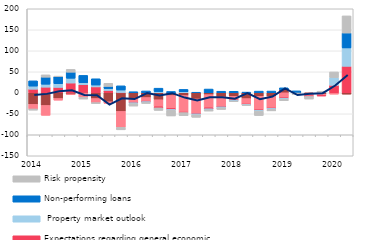
| Category | Costs of funding | Competition from other banks | Expectations regarding general economic situation |  Property market outlook | Non-performing loans  | Risk propensity |
|---|---|---|---|---|---|---|
| 2014.0 | -27.614 | -10.883 | 8.513 | 7.366 | 12.572 | -2.931 |
| nan | -30.154 | -23.565 | 13.381 | 6.958 | 16.79 | 5.591 |
| nan | -13.58 | -4.04 | 12.84 | 8.698 | 16.68 | 1.322 |
| nan | -3.194 | -0.943 | 23.215 | 11.346 | 14.413 | 6.815 |
| 2015.0 | 1.584 | -10.634 | 17.798 | 4.391 | 17.665 | -4.309 |
| nan | -13.709 | -9.748 | 14.011 | 4.433 | 14.906 | -2.291 |
| nan | -21.32 | -4.036 | 5.521 | 4.364 | 5.262 | 7.435 |
| nan | -44.371 | -37.787 | 0.672 | 5.886 | 9.984 | -6.068 |
| 2016.0 | -13.683 | -9.865 | -0.183 | -2.017 | 2.537 | -5.896 |
| nan | -11.339 | -9.602 | -0.197 | -1.974 | 4.34 | -2.332 |
| nan | -16.54 | -16.708 | -2.652 | 2.885 | 8.061 | -6.073 |
| nan | -6.439 | -30.804 | -2.596 | -1.957 | 3.101 | -13.396 |
| 2017.0 | -6.563 | -40.484 | -0.096 | 2.394 | 5.669 | -7.434 |
| nan | -14.708 | -34.121 | -1.211 | -2.234 | 1.309 | -6.144 |
| nan | -4.365 | -31.359 | -2.483 | -2.033 | 8.902 | -3.307 |
| nan | -9.63 | -23.589 | -0.294 | -2.083 | 3.686 | -4.267 |
| 2018.0 | -8.401 | -9.465 | -0.308 | -2.087 | 3.545 | -0.758 |
| nan | -13.817 | -13.719 | -0.384 | -1.143 | 1.627 | -1.188 |
| nan | -8.391 | -32.723 | -0.405 | -2.001 | 3.96 | -10.656 |
| nan | -8.386 | -28.581 | -0.415 | -2.043 | 4.097 | -3.682 |
| 2019.0 | 7.614 | -12.529 | -0.41 | -2.062 | 4.174 | -3.764 |
| nan | -0.003 | 0 | -0.494 | 0 | 4.55 | -3.594 |
| nan | -3.529 | -4.583 | -0.546 | 0 | 0 | -6.275 |
| nan | -3.387 | -3.387 | -0.556 | 0 | 0 | 3.746 |
| 2020.0 | 0 | -3.3 | 17.776 | 18.324 | 0 | 13.5 |
| nan | -3.3 | 0 | 63.053 | 43.711 | 35.524 | 40.8 |